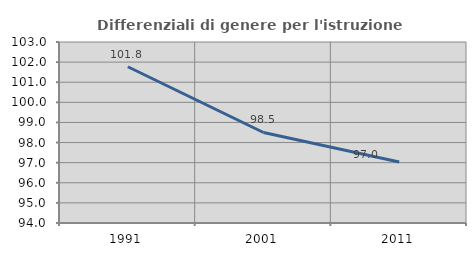
| Category | Differenziali di genere per l'istruzione superiore |
|---|---|
| 1991.0 | 101.771 |
| 2001.0 | 98.5 |
| 2011.0 | 97.037 |